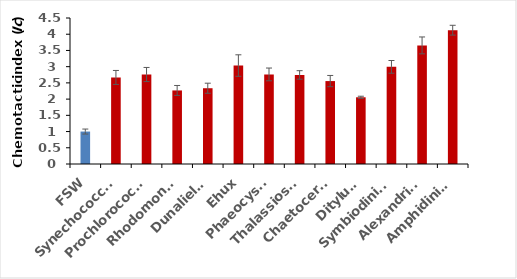
| Category | Series 0 |
|---|---|
| FSW | 1 |
| Synechococcus | 2.668 |
| Prochlorococcus | 2.758 |
| Rhodomonas | 2.267 |
| Dunaliella | 2.335 |
| Ehux | 3.034 |
| Phaeocystis | 2.761 |
| Thalassiosira | 2.745 |
| Chaetoceros | 2.556 |
| Ditylum | 2.056 |
| Symbiodinium | 2.994 |
| Alexandrium | 3.655 |
| Amphidinium | 4.124 |